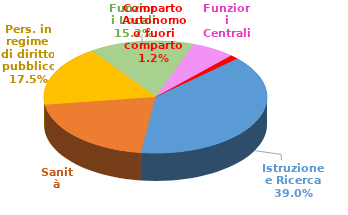
| Category | Series 0 |
|---|---|
| Istruzione e Ricerca | 1264053 |
| Sanità | 670566 |
| Pers. in regime di diritto pubblico | 568104 |
| Funzioni Locali | 492093 |
| Funzioni Centrali | 203831 |
| Comparto Autonomo o fuori comparto | 40321 |